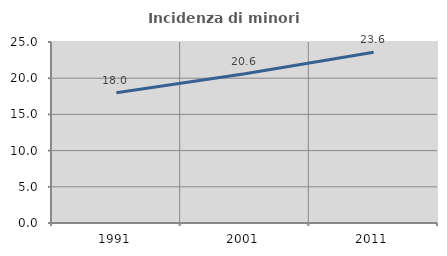
| Category | Incidenza di minori stranieri |
|---|---|
| 1991.0 | 17.993 |
| 2001.0 | 20.617 |
| 2011.0 | 23.578 |